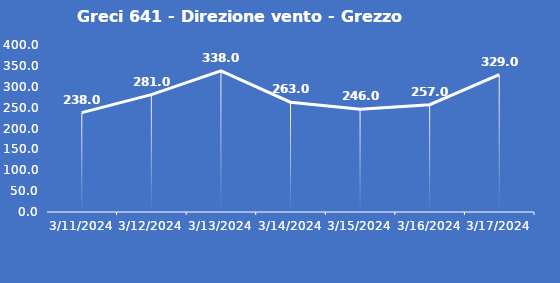
| Category | Greci 641 - Direzione vento - Grezzo (°N) |
|---|---|
| 3/11/24 | 238 |
| 3/12/24 | 281 |
| 3/13/24 | 338 |
| 3/14/24 | 263 |
| 3/15/24 | 246 |
| 3/16/24 | 257 |
| 3/17/24 | 329 |